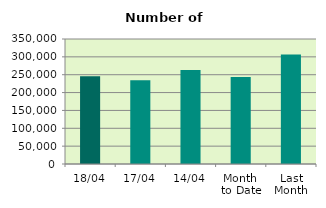
| Category | Series 0 |
|---|---|
| 18/04 | 245594 |
| 17/04 | 234636 |
| 14/04 | 263484 |
| Month 
to Date | 243439.111 |
| Last
Month | 306734.174 |